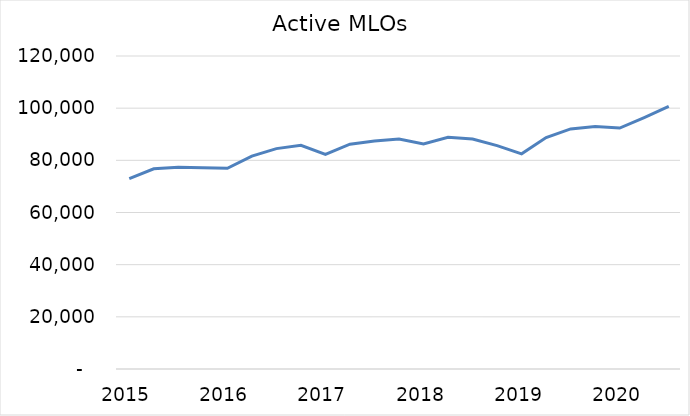
| Category | Active MLOs |
|---|---|
| 2015 | 72971 |
| 2015 | 76764 |
| 2015 | 77304 |
| 2015 | 77175 |
| 2016 | 76959 |
| 2016 | 81606 |
| 2016 | 84484 |
| 2016 | 85755 |
| 2017 | 82276 |
| 2017 | 86190 |
| 2017 | 87405 |
| 2017 | 88205 |
| 2018 | 86269 |
| 2018 | 88855 |
| 2018 | 88147 |
| 2018 | 85632 |
| 2019 | 82503 |
| 2019 | 88720 |
| 2019 | 92047 |
| 2019 | 92972 |
| 2020 | 92379 |
| 2020 | 96398 |
| 2020 | 100648 |